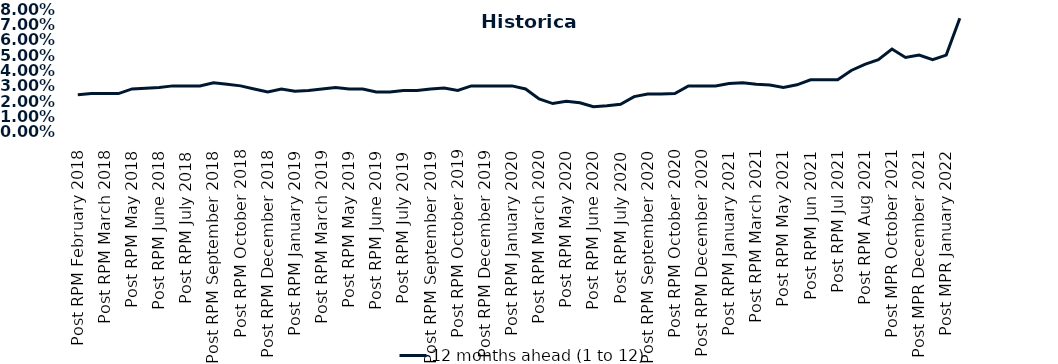
| Category | 12 months ahead (1 to 12)  |
|---|---|
| Post RPM February 2018 | 0.024 |
| Pre RPM March 2018 | 0.025 |
| Post RPM March 2018 | 0.025 |
| Pre RPM May 2018 | 0.025 |
| Post RPM May 2018 | 0.028 |
| Pre RPM June 2018 | 0.028 |
| Post RPM June 2018 | 0.029 |
| Pre RPM July 2018 | 0.03 |
| Post RPM July 2018 | 0.03 |
| Pre RPM September 2018 | 0.03 |
| Post RPM September 2018 | 0.032 |
| Pre RPM October 2018 | 0.031 |
| Post RPM October 2018 | 0.03 |
| Pre RPM December 2018 | 0.028 |
| Post RPM December 2018 | 0.026 |
| Pre RPM January 2019 | 0.028 |
| Post RPM January 2019 | 0.026 |
| Pre RPM March 2019 | 0.027 |
| Post RPM March 2019 | 0.028 |
| Pre RPM May 2019 | 0.029 |
| Post RPM May 2019 | 0.028 |
| Pre RPM June 2019 | 0.028 |
| Post RPM June 2019 | 0.026 |
| Pre RPM July 2019 | 0.026 |
| Post RPM July 2019 | 0.027 |
| Pre RPM September 2019 | 0.027 |
| Post RPM September 2019 | 0.028 |
| Pre RPM October 2019 | 0.029 |
| Post RPM October 2019 | 0.027 |
| Pre RPM December 2019 | 0.03 |
| Post RPM December 2019 | 0.03 |
| Pre RPM January 2020 | 0.03 |
| Post RPM January 2020 | 0.03 |
| Pre RPM March 2020 | 0.028 |
| Post RPM March 2020 | 0.022 |
| Pre RPM May 2020 | 0.018 |
| Post RPM May 2020 | 0.02 |
| Pre RPM June 2020 | 0.019 |
| Post RPM June 2020 | 0.016 |
| Pre RPM July 2020 | 0.017 |
| Post RPM July 2020 | 0.018 |
| Pre RPM September 2020 | 0.023 |
| Post RPM September 2020 | 0.025 |
| Pre RPM October 2020 | 0.025 |
| Post RPM October 2020 | 0.025 |
| Pre RPM December 2020 | 0.03 |
|  Post RPM December 2020 | 0.03 |
| Pre RPM January 2021 | 0.03 |
| Post RPM January 2021 | 0.032 |
|  Pre RPM March 2021 | 0.032 |
|  Post RPM March 2021 | 0.031 |
|  Pre RPM May 2021 | 0.03 |
|  Post RPM May 2021 | 0.029 |
|  Pre RPM Jun 2021 | 0.031 |
|   Post RPM Jun 2021 | 0.034 |
| Pre RPM Jul 2021 | 0.034 |
|  Post RPM Jul 2021 | 0.034 |
| Pre RPM Aug 2021 | 0.04 |
|  Post RPM Aug 2021 | 0.044 |
| Pre MPR October 2021 | 0.047 |
| Post MPR October 2021 | 0.054 |
| Pre MPR December 2021 | 0.048 |
| Post MPR December 2021 | 0.05 |
| Pre MPR January 2022 | 0.047 |
| Post MPR January 2022 | 0.05 |
| Pre MPR March 2022 | 0.074 |